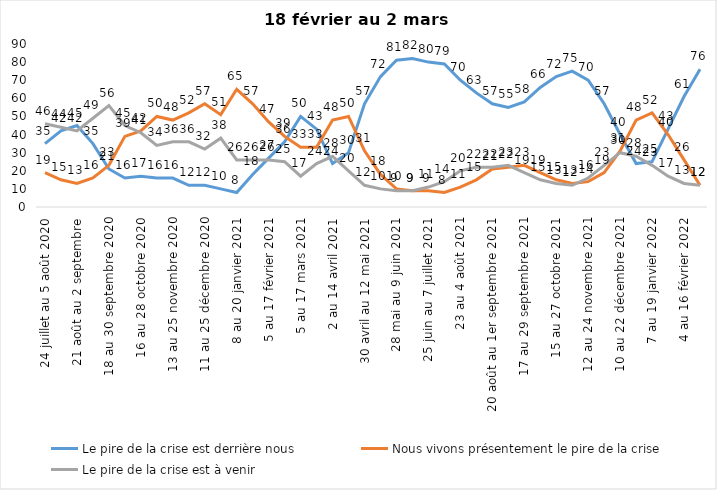
| Category | Le pire de la crise est derrière nous | Nous vivons présentement le pire de la crise | Le pire de la crise est à venir |
|---|---|---|---|
| 24 juillet au 5 août 2020 | 35 | 19 | 46 |
| 7 au 19 août 2020 | 42 | 15 | 44 |
| 21 août au 2 septembre | 45 | 13 | 42 |
| 4 au 16 septembre 2020 | 35 | 16 | 49 |
| 18 au 30 septembre 2020 | 21 | 23 | 56 |
| 2 au 14 octobre 2020 | 16 | 39 | 45 |
| 16 au 28 octobre 2020 | 17 | 42 | 41 |
| 30 octobre au 11 novembre 2020 | 16 | 50 | 34 |
| 13 au 25 novembre 2020 | 16 | 48 | 36 |
| 27 au 9 décembre 2020 | 12 | 52 | 36 |
| 11 au 25 décembre 2020 | 12 | 57 | 32 |
| 25 décembre 2020 au 6 janvier 2021 | 10 | 51 | 38 |
| 8 au 20 janvier 2021 | 8 | 65 | 26 |
| 22 janvier au 3 février 2021 | 18 | 57 | 26 |
| 5 au 17 février 2021 | 27 | 47 | 26 |
| 19 février au 3 mars 2021 | 36 | 39 | 25 |
| 5 au 17 mars 2021 | 50 | 33 | 17 |
| 19 au 31 mars 2021 | 43 | 33 | 24 |
| 2 au 14 avril 2021 | 24 | 48 | 28 |
| 16 au 28 avril 2021 | 30 | 50 | 20 |
| 30 avril au 12 mai 2021 | 57 | 31 | 12 |
| 14 au 26 mai 2021 | 72 | 18 | 10 |
| 28 mai au 9 juin 2021 | 81 | 10 | 9 |
| 11 au 23 juin 2021 | 82 | 9 | 9 |
| 25 juin au 7 juillet 2021 | 80 | 9 | 11 |
| 9 au 21 juillet 2021 | 79 | 8 | 14 |
| 23 au 4 août 2021 | 70 | 11 | 20 |
| 6 au 18 août 2021 | 63 | 15 | 22 |
| 20 août au 1er septembre 2021 | 57 | 21 | 22 |
| 3 au 15 septembre 2021 | 55 | 22 | 23 |
| 17 au 29 septembre 2021 | 58 | 23 | 19 |
| 1 au 13 octobre 2021 | 66 | 19 | 15 |
| 15 au 27 octobre 2021 | 72 | 15 | 13 |
| 29 octobre au 10 novembre 2021 | 75 | 13 | 12 |
| 12 au 24 novembre 2021 | 70 | 14 | 16 |
| 26 novembre au 8 décembre 2021 | 57 | 19 | 23 |
| 10 au 22 décembre 2021 | 40 | 31 | 30 |
| 24 décembre 2021 au 5 janvier 2022 | 24 | 48 | 28 |
| 7 au 19 janvier 2022 | 25 | 52 | 23 |
| 21 janvier au 2 février 2022 | 43 | 40 | 17 |
| 4 au 16 février 2022 | 61 | 26 | 13 |
| 18 février au 2 mars  2022 | 76 | 12 | 12 |